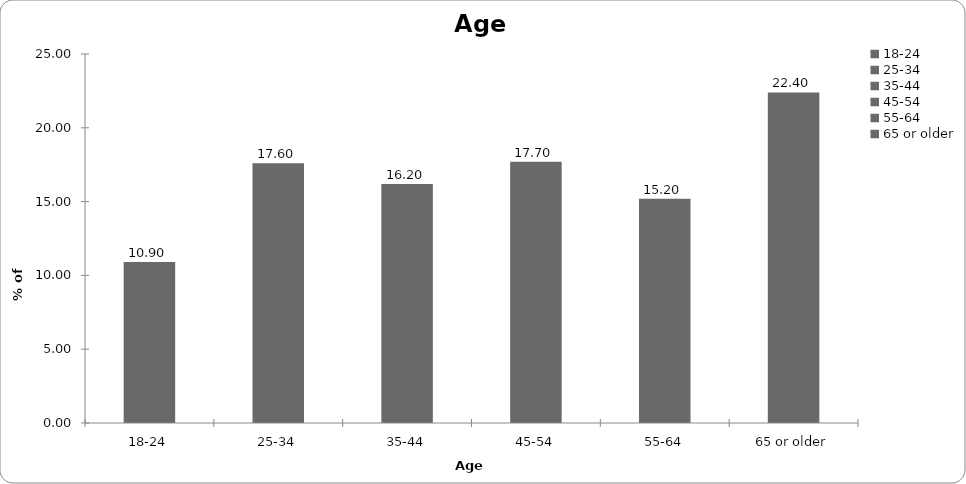
| Category | Age |
|---|---|
| 18-24 | 10.9 |
| 25-34 | 17.6 |
| 35-44 | 16.2 |
| 45-54 | 17.7 |
| 55-64 | 15.2 |
| 65 or older | 22.4 |